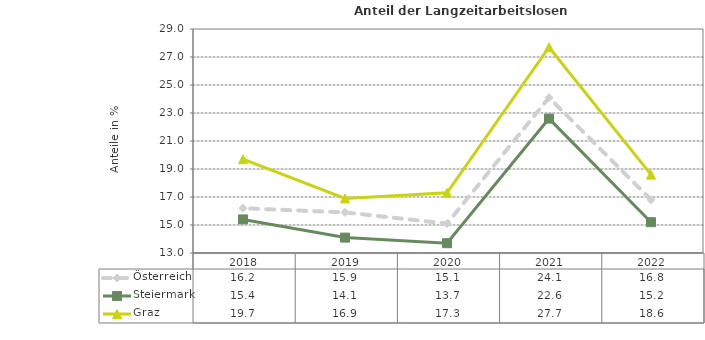
| Category | Österreich | Steiermark | Graz |
|---|---|---|---|
| 2022.0 | 16.8 | 15.2 | 18.6 |
| 2021.0 | 24.1 | 22.6 | 27.7 |
| 2020.0 | 15.1 | 13.7 | 17.3 |
| 2019.0 | 15.9 | 14.1 | 16.9 |
| 2018.0 | 16.2 | 15.4 | 19.7 |